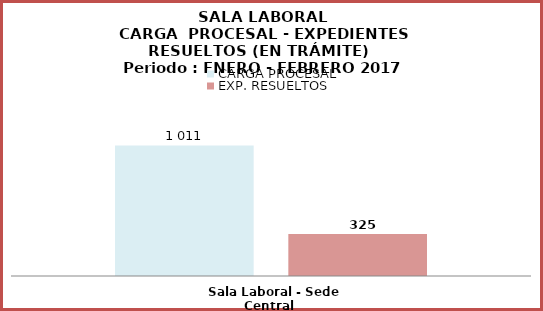
| Category | CARGA PROCESAL | EXP. RESUELTOS |
|---|---|---|
| Sala Laboral - Sede Central | 1011 | 325 |